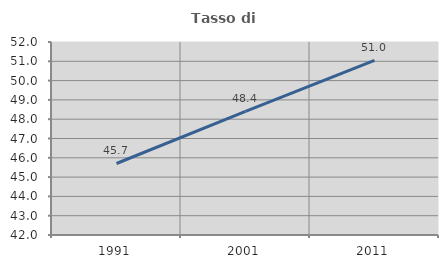
| Category | Tasso di occupazione   |
|---|---|
| 1991.0 | 45.705 |
| 2001.0 | 48.402 |
| 2011.0 | 51.044 |